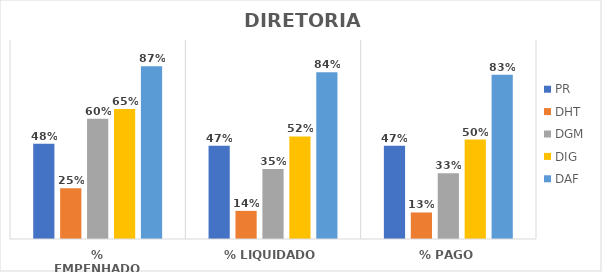
| Category | PR | DHT | DGM | DIG | DAF |
|---|---|---|---|---|---|
| % EMPENHADO | 0.479 | 0.255 | 0.604 | 0.653 | 0.868 |
| % LIQUIDADO | 0.469 | 0.141 | 0.351 | 0.515 | 0.838 |
| % PAGO | 0.469 | 0.133 | 0.33 | 0.5 | 0.825 |